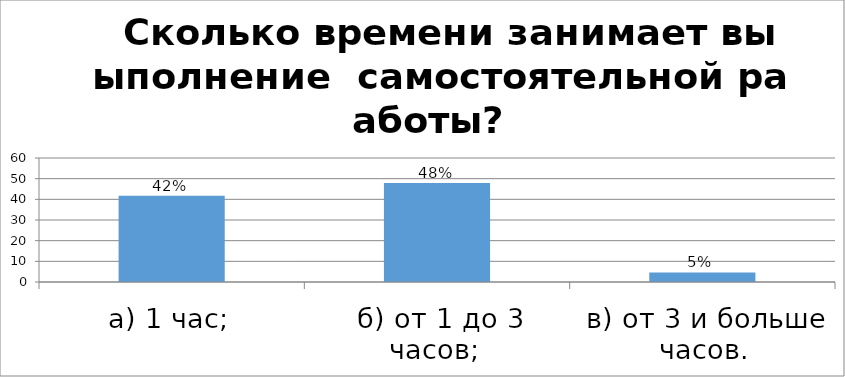
| Category | Series 0 |
|---|---|
| а) 1 час; | 41.753 |
| б) от 1 до 3 часов;  | 47.938 |
| в) от 3 и больше часов. | 4.639 |